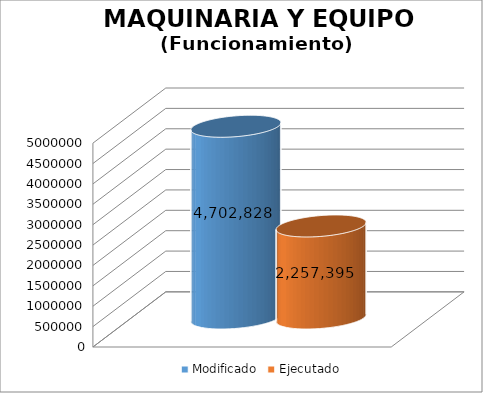
| Category | Modificado | Ejecutado |
|---|---|---|
| 0 | 4702828 | 2257395.02 |